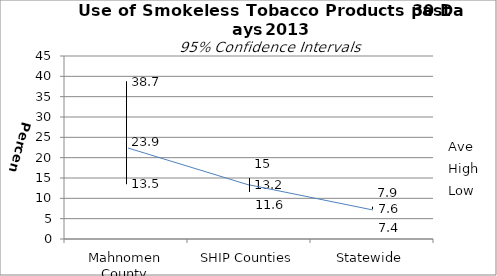
| Category | Ave | High | Low |
|---|---|---|---|
| Mahnomen County | 23.9 | 38.7 | 13.5 |
| SHIP Counties | 13.2 | 15 | 11.6 |
| Statewide | 7.6 | 7.9 | 7.4 |